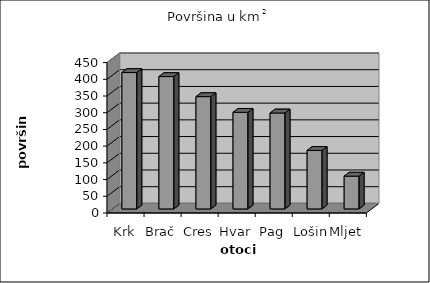
| Category | Površina u km2 |
|---|---|
| Krk | 408 |
| Brač | 396 |
| Cres | 336 |
| Hvar | 289 |
| Pag | 287 |
| Lošinj | 175 |
| Mljet | 98 |